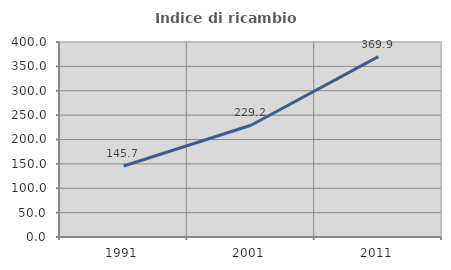
| Category | Indice di ricambio occupazionale  |
|---|---|
| 1991.0 | 145.652 |
| 2001.0 | 229.213 |
| 2011.0 | 369.892 |